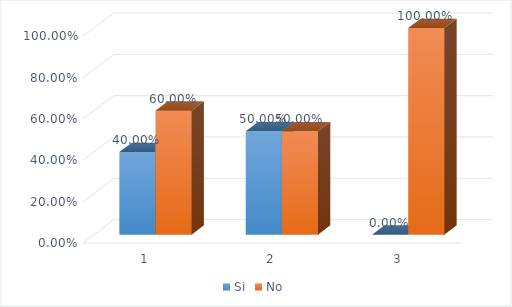
| Category | Si | No |
|---|---|---|
| 0 | 0.4 | 0.6 |
| 1 | 0.5 | 0.5 |
| 2 | 0 | 1 |